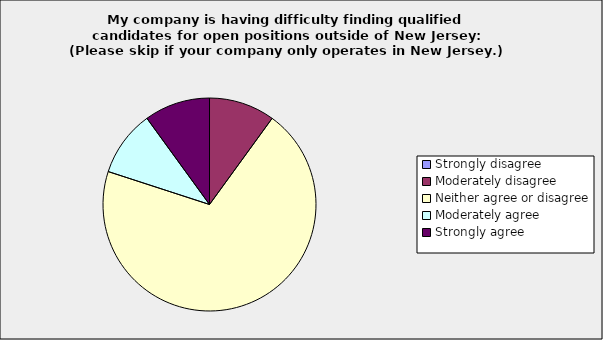
| Category | Series 0 |
|---|---|
| Strongly disagree | 0 |
| Moderately disagree | 0.1 |
| Neither agree or disagree | 0.7 |
| Moderately agree | 0.1 |
| Strongly agree | 0.1 |